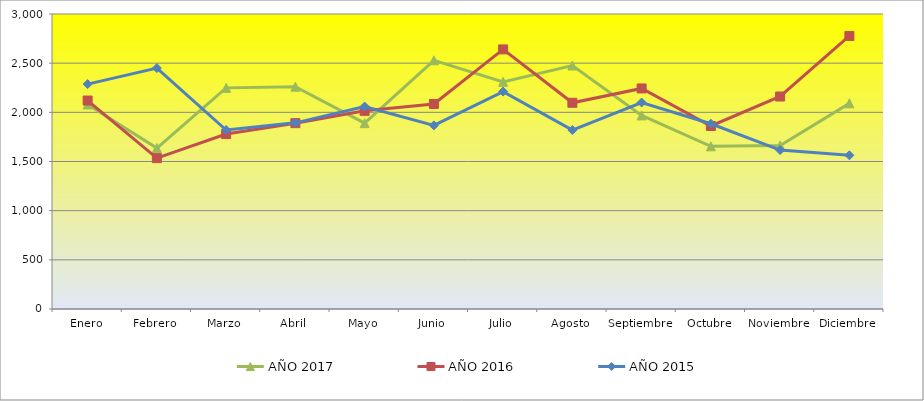
| Category | AÑO 2017 | AÑO 2016 | AÑO 2015 |
|---|---|---|---|
| Enero | 2079.583 | 2120 | 2287 |
| Febrero | 1636.25 | 1534 | 2450 |
| Marzo | 2248.75 | 1779 | 1820 |
| Abril | 2260.417 | 1890 | 1893 |
| Mayo | 1890 | 2015 | 2059 |
| Junio | 2528.75 | 2085 | 1867 |
| Julio | 2310 | 2640 | 2211 |
| Agosto | 2476.25 | 2097 | 1820 |
| Septiembre | 1968.75 | 2243 | 2100 |
| Octubre | 1654.286 | 1861 | 1884 |
| Noviembre | 1662.857 | 2161 | 1616 |
| Diciembre | 2091.25 | 2777 | 1563 |